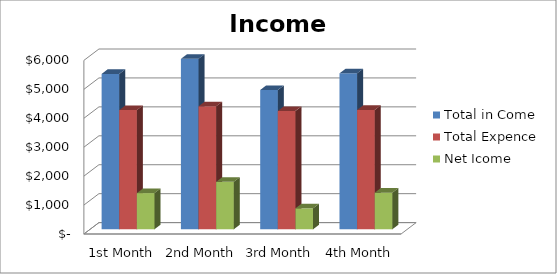
| Category | Total in Come | Total Expence | Net Icome |
|---|---|---|---|
| 1st Month | 5370 | 4120 | 1250 |
| 2nd Month | 5890 | 4250 | 1640 |
| 3rd Month | 4815 | 4090 | 725 |
| 4th Month | 5390 | 4125 | 1265 |